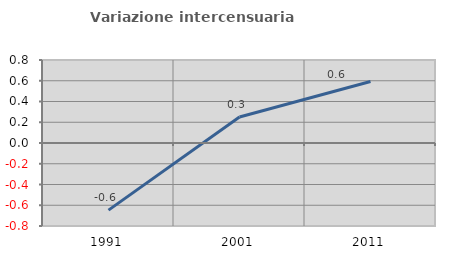
| Category | Variazione intercensuaria annua |
|---|---|
| 1991.0 | -0.647 |
| 2001.0 | 0.25 |
| 2011.0 | 0.592 |